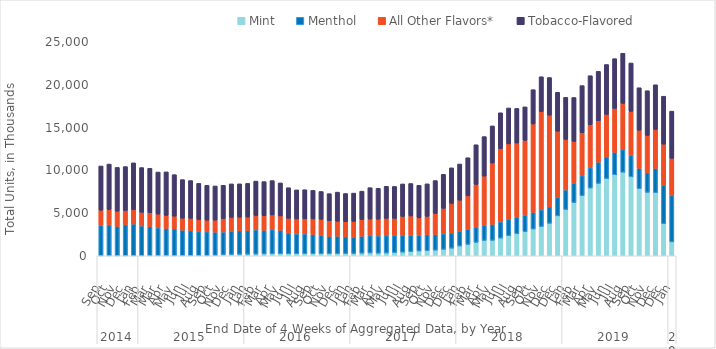
| Category | Mint | Menthol | All Other Flavors* | Tobacco-Flavored |
|---|---|---|---|---|
| 0 | 1.783 | 3537.536 | 1781.219 | 5170.534 |
| 1 | 1.384 | 3611.182 | 1790.995 | 5312.379 |
| 2 | 1.776 | 3430.646 | 1775.811 | 5116.354 |
| 3 | 1.052 | 3632.587 | 1653.21 | 5132.509 |
| 4 | 7.725 | 3711.079 | 1664.824 | 5472.958 |
| 5 | 11.199 | 3481.336 | 1589.697 | 5222.378 |
| 6 | 12.689 | 3418.537 | 1605.974 | 5180.395 |
| 7 | 13.295 | 3250.653 | 1597.245 | 4925.273 |
| 8 | 15.67 | 3173.651 | 1537.909 | 5075.873 |
| 9 | 17.062 | 3160.299 | 1450.002 | 4851.197 |
| 10 | 16.972 | 2969.493 | 1403.69 | 4507.615 |
| 11 | 15.829 | 2937.376 | 1423.111 | 4412.654 |
| 12 | 17.724 | 2815.95 | 1390.342 | 4234.545 |
| 13 | 18.778 | 2790.838 | 1347.721 | 4070.028 |
| 14 | 55.466 | 2706.234 | 1399.305 | 3997.036 |
| 15 | 132.194 | 2645.514 | 1552.23 | 3904.453 |
| 16 | 157.05 | 2732.194 | 1597.462 | 3911.888 |
| 17 | 172.762 | 2767.944 | 1566.966 | 3898.044 |
| 18 | 185.138 | 2764.192 | 1574.509 | 3931.843 |
| 19 | 201.515 | 2827.175 | 1671.989 | 4027.742 |
| 20 | 217.293 | 2747.221 | 1700.901 | 3998.699 |
| 21 | 226.503 | 2811.509 | 1731.128 | 4014.27 |
| 22 | 233.987 | 2738.845 | 1679.344 | 3862.082 |
| 23 | 241.107 | 2429.978 | 1704.007 | 3577.814 |
| 24 | 233.92 | 2322.677 | 1739.308 | 3404.244 |
| 25 | 240.879 | 2316.608 | 1761.029 | 3399.395 |
| 26 | 237.096 | 2253.939 | 1813.807 | 3337.251 |
| 27 | 241.614 | 2145.303 | 1870.21 | 3252.823 |
| 28 | 251.889 | 2018.85 | 1812.96 | 3174.28 |
| 29 | 258.565 | 2035.954 | 1740.961 | 3403.294 |
| 30 | 264.78 | 1960.266 | 1764.498 | 3284.812 |
| 31 | 278.929 | 1925.971 | 1807.761 | 3309.755 |
| 32 | 308.169 | 1989.153 | 1935.415 | 3318.62 |
| 33 | 332.86 | 2034.69 | 1925.208 | 3663.459 |
| 34 | 305.446 | 2022.003 | 1945.859 | 3608.99 |
| 35 | 326.939 | 2035.105 | 2005.146 | 3751.521 |
| 36 | 373.011 | 2001.629 | 1985.752 | 3741.645 |
| 37 | 429.797 | 1976.926 | 2188.842 | 3798.769 |
| 38 | 492.769 | 1924.045 | 2232.785 | 3792.775 |
| 39 | 559.818 | 1859.1 | 2009.936 | 3803.101 |
| 40 | 590.184 | 1881.093 | 2137.54 | 3795.579 |
| 41 | 659.172 | 1823.344 | 2455.292 | 3850.348 |
| 42 | 749.692 | 1815.611 | 2982.894 | 3971.412 |
| 43 | 891.568 | 1789.143 | 3433.339 | 4160.409 |
| 44 | 1143.319 | 1725.492 | 3625.514 | 4228.214 |
| 45 | 1339.111 | 1779.084 | 3879.666 | 4457.984 |
| 46 | 1574.126 | 1799.72 | 4964.943 | 4633.077 |
| 47 | 1795.43 | 1790.166 | 5716.464 | 4623.041 |
| 48 | 1812.458 | 1846.288 | 7172.348 | 4344.081 |
| 49 | 2065.579 | 1896.604 | 8554.701 | 4191.646 |
| 50 | 2351.929 | 1922.45 | 8793.307 | 4201.253 |
| 51 | 2592.131 | 1946.402 | 8630.951 | 4044.179 |
| 52 | 2817.142 | 1949.236 | 8716.429 | 3914.617 |
| 53 | 3127.434 | 1944.219 | 10325.757 | 4006.188 |
| 54 | 3425.127 | 1945.212 | 11465.346 | 4080.468 |
| 55 | 3797.931 | 1931.815 | 10693.157 | 4400.468 |
| 56 | 4663.619 | 2151.465 | 7735.831 | 4547.39 |
| 57 | 5407.854 | 2283.678 | 5903.772 | 4910.446 |
| 58 | 6220.21 | 2265.785 | 4874.938 | 5130.544 |
| 59 | 7014.527 | 2335.502 | 5015.273 | 5514.036 |
| 60 | 7916.505 | 2372.633 | 5027.811 | 5719.706 |
| 61 | 8462.92 | 2467.454 | 4843.827 | 5769.82 |
| 62 | 9026.665 | 2533.701 | 4954.301 | 5829.728 |
| 63 | 9462.359 | 2617.678 | 5133.794 | 5813.267 |
| 64 | 9767.847 | 2620.297 | 5414.842 | 5857.115 |
| 65 | 9220.994 | 2510.372 | 5139.807 | 5650.923 |
| 66 | 7843.484 | 2368.097 | 4456.674 | 4962.808 |
| 67 | 7413.988 | 2293.187 | 4349.194 | 5226.792 |
| 68 | 7378.045 | 2831.264 | 4548.355 | 5221.85 |
| 69 | 3751.176 | 4486.882 | 4801.917 | 5599.226 |
| 70 | 1625.317 | 5414.209 | 4347.639 | 5508.671 |